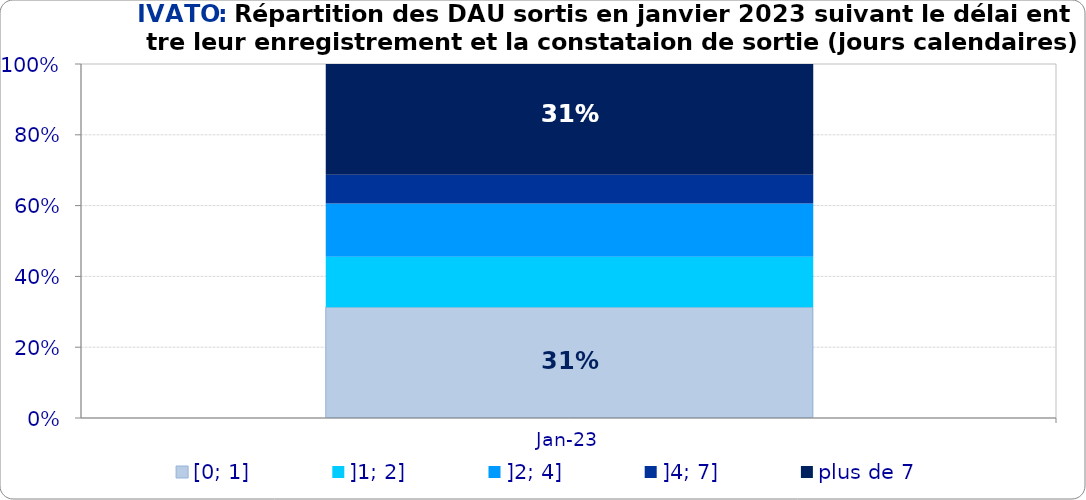
| Category | [0; 1] | ]1; 2] | ]2; 4] | ]4; 7] | plus de 7 |
|---|---|---|---|---|---|
| 2023-01-01 | 0.313 | 0.142 | 0.151 | 0.081 | 0.313 |